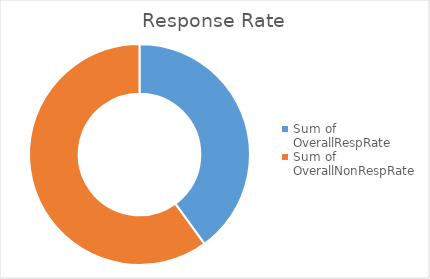
| Category | Total |
|---|---|
| Sum of OverallRespRate | 40 |
| Sum of OverallNonRespRate | 60 |